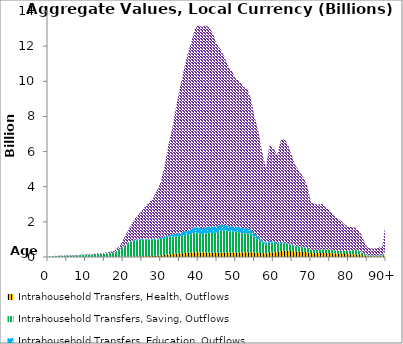
| Category | Intrahousehold Transfers, Health, Outflows | Intrahousehold Transfers, Saving, Outflows | Intrahousehold Transfers, Education, Outflows | Intrahousehold Transfers, Consumption other than health and education, Outflows |
|---|---|---|---|---|
| 0 | 0.01 | 23.039 | 0.073 | 6.58 |
|  | 0.034 | 35.801 | 0.117 | 7.59 |
| 2 | 0.121 | 55.753 | 0.187 | 8.776 |
| 3 | 0.315 | 74.456 | 0.242 | 10.343 |
| 4 | 0.585 | 77.802 | 0.146 | 11.653 |
| 5 | 0.784 | 81.67 | 0.116 | 13.322 |
| 6 | 0.753 | 92.655 | 0.116 | 15.356 |
| 7 | 0.629 | 87.801 | 0.108 | 16.838 |
| 8 | 0.602 | 93.158 | 0.141 | 18.197 |
| 9 | 0.63 | 119.66 | 0.215 | 21.134 |
| 10 | 0.72 | 121.838 | 0.195 | 25.198 |
| 11 | 0.939 | 122.555 | 0.178 | 29.403 |
| 12 | 1.18 | 145.952 | 0.169 | 34.426 |
| 13 | 1.5 | 182.642 | 0.184 | 42.645 |
| 14 | 1.846 | 162.442 | 0.259 | 46.428 |
| 15 | 2.379 | 181.579 | 0.566 | 54.269 |
| 16 | 2.842 | 202.568 | 0.906 | 65.14 |
| 17 | 3.747 | 237.735 | 1.657 | 83.686 |
| 18 | 5.149 | 300.249 | 3.191 | 114.328 |
| 19 | 6.912 | 413.763 | 5.062 | 173.446 |
| 20 | 10.043 | 565.117 | 9.035 | 411.095 |
| 21 | 15.05 | 722.871 | 16.477 | 615.556 |
| 22 | 20.987 | 856.719 | 26.007 | 868.127 |
| 23 | 27.169 | 919.608 | 33.965 | 1170.133 |
| 24 | 33.501 | 924.752 | 41.976 | 1392.583 |
| 25 | 39.78 | 940.438 | 43.187 | 1621.683 |
| 26 | 46.043 | 953.023 | 48.328 | 1857.283 |
| 27 | 53.302 | 931.547 | 49.36 | 2089.31 |
| 28 | 62.836 | 913.298 | 49.947 | 2319.826 |
| 29 | 75.079 | 920.658 | 47.656 | 2731.822 |
| 30 | 90.142 | 930.695 | 61.885 | 3190.964 |
| 31 | 115.763 | 954.875 | 68.998 | 4010.516 |
| 32 | 144.708 | 1018.319 | 86.55 | 5076.529 |
| 33 | 163.99 | 1003.016 | 106.502 | 5959.305 |
| 34 | 187.541 | 984.098 | 138.422 | 7105.318 |
| 35 | 205.846 | 982.835 | 168.292 | 8171.829 |
| 36 | 221.163 | 1010.375 | 205.859 | 9044.269 |
| 37 | 237.596 | 1014.064 | 237.164 | 9921.004 |
| 38 | 251.221 | 1029.848 | 266.119 | 10565.031 |
| 39 | 265.6 | 1131.809 | 305.819 | 11212.413 |
| 40 | 267.064 | 1107.08 | 321.743 | 11521.058 |
| 41 | 258.671 | 1029.303 | 339.185 | 11456.951 |
| 42 | 255.71 | 1075.25 | 357.406 | 11487.751 |
| 43 | 249.129 | 1136.436 | 369.319 | 11285.78 |
| 44 | 245.138 | 1118.158 | 371.208 | 10947.719 |
| 45 | 240.001 | 1147.575 | 357.958 | 10327.2 |
| 46 | 244.279 | 1255.136 | 338.088 | 9977.023 |
| 47 | 247.394 | 1273.645 | 317.317 | 9548.448 |
| 48 | 249.575 | 1209.204 | 291.763 | 9099.601 |
| 49 | 253.444 | 1202.199 | 292.506 | 8821.63 |
| 50 | 253.469 | 1197.061 | 283.468 | 8419.565 |
| 51 | 261.356 | 1139.034 | 292.608 | 8326.732 |
| 52 | 262.575 | 1087.632 | 288.785 | 8048.784 |
| 53 | 269.652 | 1096.248 | 280.602 | 7949.152 |
| 54 | 266.733 | 1057.585 | 241.116 | 7469.17 |
| 55 | 251.951 | 866.71 | 198.64 | 6651.896 |
| 56 | 243.673 | 756.917 | 148.48 | 6029.29 |
| 57 | 218.239 | 617.344 | 104.513 | 5064.295 |
| 58 | 198.553 | 519.417 | 85.841 | 4298.47 |
| 59 | 268.768 | 571.045 | 88.352 | 5468.103 |
| 60 | 277.128 | 542.096 | 71.037 | 5333.326 |
| 61 | 273.284 | 459.691 | 54.889 | 5000.789 |
| 62 | 334.388 | 468.199 | 57.056 | 5806.401 |
| 63 | 356.009 | 419.459 | 36.29 | 5892.654 |
| 64 | 351.989 | 389.221 | 30.817 | 5577.886 |
| 65 | 331.273 | 342.073 | 24.209 | 5027.735 |
| 66 | 311.696 | 297.292 | 15.366 | 4532.406 |
| 67 | 305.646 | 281.999 | 11.576 | 4265.459 |
| 68 | 296.595 | 259.532 | 8.922 | 3974.953 |
| 69 | 276.623 | 244.514 | 8.571 | 3546.523 |
| 70 | 223.181 | 184.109 | 5.633 | 2742.968 |
| 71 | 221.901 | 175.273 | 6.061 | 2620.558 |
| 72 | 225.144 | 185.593 | 6.16 | 2565.435 |
| 73 | 236.022 | 216.495 | 7.744 | 2577.28 |
| 74 | 226.944 | 188.888 | 2.908 | 2380.886 |
| 75 | 223.008 | 200.996 | 2.058 | 2250.978 |
| 76 | 204.894 | 196.463 | 1.445 | 1986.679 |
| 77 | 197.476 | 159.501 | 1.381 | 1843.212 |
| 78 | 190.7 | 157.756 | 0.862 | 1727.54 |
| 79 | 171.666 | 166.115 | 0.623 | 1507.471 |
| 80 | 160.778 | 186.999 | 0.915 | 1374.196 |
| 81 | 158.087 | 217.252 | 1.336 | 1309.64 |
| 82 | 153.371 | 281.879 | 1.597 | 1242.882 |
| 83 | 136.173 | 187.596 | 2.213 | 1126.418 |
| 84 | 92.367 | 110.597 | 2.837 | 781.653 |
| 85 | 52.162 | 53.098 | 3.699 | 457.471 |
| 86 | 41.629 | 45.504 | 4.389 | 395.274 |
| 87 | 37.737 | 44.489 | 3.696 | 390.848 |
| 88 | 38.901 | 49.931 | 6.099 | 444.033 |
| 89 | 40.658 | 54.799 | 9.914 | 489.365 |
| 90+ | 140.495 | 190.885 | 51.144 | 1708.183 |